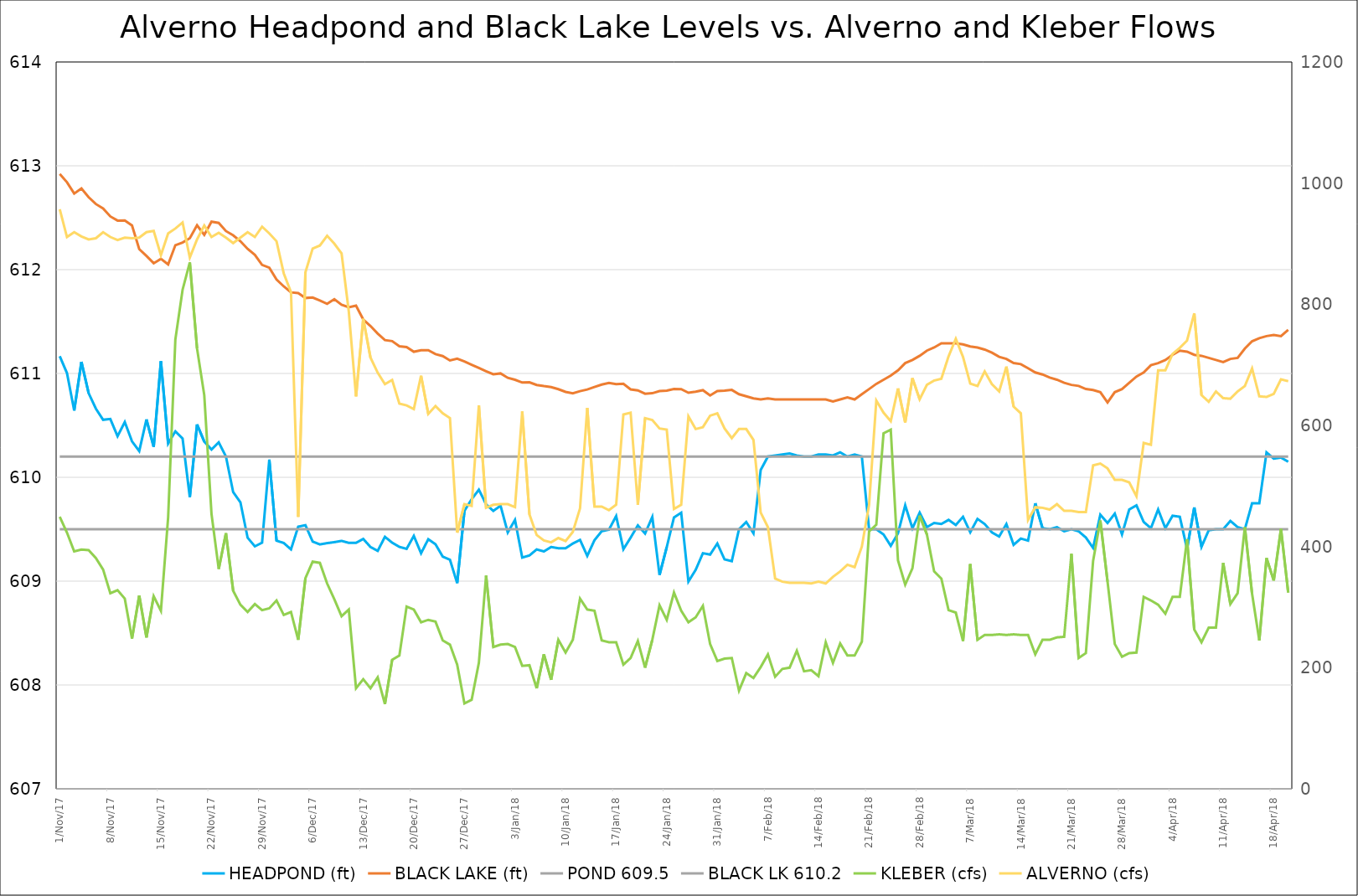
| Category | HEADPOND (ft) | BLACK LAKE (ft) | POND 609.5 | BLACK LK 610.2 |
|---|---|---|---|---|
| 2017-11-01 | 611.166 | 612.922 | 609.5 | 610.2 |
| 2017-11-02 | 611.004 | 612.842 | 609.5 | 610.2 |
| 2017-11-03 | 610.644 | 612.733 | 609.5 | 610.2 |
| 2017-11-04 | 611.111 | 612.782 | 609.5 | 610.2 |
| 2017-11-05 | 610.81 | 612.698 | 609.5 | 610.2 |
| 2017-11-06 | 610.662 | 612.632 | 609.5 | 610.2 |
| 2017-11-07 | 610.554 | 612.589 | 609.5 | 610.2 |
| 2017-11-08 | 610.562 | 612.513 | 609.5 | 610.2 |
| 2017-11-09 | 610.396 | 612.472 | 609.5 | 610.2 |
| 2017-11-10 | 610.532 | 612.473 | 609.5 | 610.2 |
| 2017-11-11 | 610.346 | 612.425 | 609.5 | 610.2 |
| 2017-11-12 | 610.253 | 612.198 | 609.5 | 610.2 |
| 2017-11-13 | 610.557 | 612.132 | 609.5 | 610.2 |
| 2017-11-14 | 610.294 | 612.061 | 609.5 | 610.2 |
| 2017-11-15 | 611.119 | 612.104 | 609.5 | 610.2 |
| 2017-11-16 | 610.325 | 612.051 | 609.5 | 610.2 |
| 2017-11-17 | 610.443 | 612.235 | 609.5 | 610.2 |
| 2017-11-18 | 610.373 | 612.261 | 609.5 | 610.2 |
| 2017-11-19 | 609.809 | 612.303 | 609.5 | 610.2 |
| 2017-11-20 | 610.509 | 612.427 | 609.5 | 610.2 |
| 2017-11-21 | 610.344 | 612.336 | 609.5 | 610.2 |
| 2017-11-22 | 610.268 | 612.462 | 609.5 | 610.2 |
| 2017-11-23 | 610.337 | 612.45 | 609.5 | 610.2 |
| 2017-11-24 | 610.2 | 612.371 | 609.5 | 610.2 |
| 2017-11-25 | 609.857 | 612.331 | 609.5 | 610.2 |
| 2017-11-26 | 609.76 | 612.274 | 609.5 | 610.2 |
| 2017-11-27 | 609.418 | 612.199 | 609.5 | 610.2 |
| 2017-11-28 | 609.335 | 612.143 | 609.5 | 610.2 |
| 2017-11-29 | 609.371 | 612.046 | 609.5 | 610.2 |
| 2017-11-30 | 610.17 | 612.018 | 609.5 | 610.2 |
| 2017-12-01 | 609.39 | 611.905 | 609.5 | 610.2 |
| 2017-12-02 | 609.367 | 611.839 | 609.5 | 610.2 |
| 2017-12-03 | 609.306 | 611.781 | 609.5 | 610.2 |
| 2017-12-04 | 609.525 | 611.774 | 609.5 | 610.2 |
| 2017-12-05 | 609.539 | 611.727 | 609.5 | 610.2 |
| 2017-12-06 | 609.381 | 611.732 | 609.5 | 610.2 |
| 2017-12-07 | 609.354 | 611.703 | 609.5 | 610.2 |
| 2017-12-08 | 609.366 | 611.67 | 609.5 | 610.2 |
| 2017-12-09 | 609.375 | 611.715 | 609.5 | 610.2 |
| 2017-12-10 | 609.388 | 611.662 | 609.5 | 610.2 |
| 2017-12-11 | 609.369 | 611.638 | 609.5 | 610.2 |
| 2017-12-12 | 609.369 | 611.653 | 609.5 | 610.2 |
| 2017-12-13 | 609.407 | 611.52 | 609.5 | 610.2 |
| 2017-12-14 | 609.329 | 611.457 | 609.5 | 610.2 |
| 2017-12-15 | 609.291 | 611.384 | 609.5 | 610.2 |
| 2017-12-16 | 609.427 | 611.321 | 609.5 | 610.2 |
| 2017-12-17 | 609.371 | 611.312 | 609.5 | 610.2 |
| 2017-12-18 | 609.33 | 611.261 | 609.5 | 610.2 |
| 2017-12-19 | 609.311 | 611.254 | 609.5 | 610.2 |
| 2017-12-20 | 609.436 | 611.209 | 609.5 | 610.2 |
| 2017-12-21 | 609.269 | 611.223 | 609.5 | 610.2 |
| 2017-12-22 | 609.404 | 611.224 | 609.5 | 610.2 |
| 2017-12-23 | 609.355 | 611.186 | 609.5 | 610.2 |
| 2017-12-24 | 609.236 | 611.168 | 609.5 | 610.2 |
| 2017-12-25 | 609.206 | 611.125 | 609.5 | 610.2 |
| 2017-12-26 | 608.981 | 611.142 | 609.5 | 610.2 |
| 2017-12-27 | 609.676 | 611.115 | 609.5 | 610.2 |
| 2017-12-28 | 609.789 | 611.084 | 609.5 | 610.2 |
| 2017-12-29 | 609.881 | 611.053 | 609.5 | 610.2 |
| 2017-12-30 | 609.739 | 611.022 | 609.5 | 610.2 |
| 2017-12-31 | 609.676 | 610.992 | 609.5 | 610.2 |
| 2018-01-01 | 609.726 | 611.001 | 609.5 | 610.2 |
| 2018-01-02 | 609.469 | 610.958 | 609.5 | 610.2 |
| 2018-01-03 | 609.59 | 610.939 | 609.5 | 610.2 |
| 2018-01-04 | 609.227 | 610.913 | 609.5 | 610.2 |
| 2018-01-05 | 609.247 | 610.915 | 609.5 | 610.2 |
| 2018-01-06 | 609.305 | 610.889 | 609.5 | 610.2 |
| 2018-01-07 | 609.286 | 610.878 | 609.5 | 610.2 |
| 2018-01-08 | 609.329 | 610.869 | 609.5 | 610.2 |
| 2018-01-09 | 609.317 | 610.848 | 609.5 | 610.2 |
| 2018-01-10 | 609.317 | 610.823 | 609.5 | 610.2 |
| 2018-01-11 | 609.362 | 610.808 | 609.5 | 610.2 |
| 2018-01-12 | 609.397 | 610.83 | 609.5 | 610.2 |
| 2018-01-13 | 609.243 | 610.845 | 609.5 | 610.2 |
| 2018-01-14 | 609.395 | 610.869 | 609.5 | 610.2 |
| 2018-01-15 | 609.481 | 610.893 | 609.5 | 610.2 |
| 2018-01-16 | 609.496 | 610.909 | 609.5 | 610.2 |
| 2018-01-17 | 609.627 | 610.897 | 609.5 | 610.2 |
| 2018-01-18 | 609.307 | 610.901 | 609.5 | 610.2 |
| 2018-01-19 | 609.419 | 610.847 | 609.5 | 610.2 |
| 2018-01-20 | 609.537 | 610.837 | 609.5 | 610.2 |
| 2018-01-21 | 609.459 | 610.805 | 609.5 | 610.2 |
| 2018-01-22 | 609.618 | 610.81 | 609.5 | 610.2 |
| 2018-01-23 | 609.06 | 610.831 | 609.5 | 610.2 |
| 2018-01-24 | 609.327 | 610.834 | 609.5 | 610.2 |
| 2018-01-25 | 609.613 | 610.85 | 609.5 | 610.2 |
| 2018-01-26 | 609.659 | 610.849 | 609.5 | 610.2 |
| 2018-01-27 | 608.996 | 610.814 | 609.5 | 610.2 |
| 2018-01-28 | 609.108 | 610.825 | 609.5 | 610.2 |
| 2018-01-29 | 609.269 | 610.839 | 609.5 | 610.2 |
| 2018-01-30 | 609.255 | 610.788 | 609.5 | 610.2 |
| 2018-01-31 | 609.362 | 610.83 | 609.5 | 610.2 |
| 2018-02-01 | 609.21 | 610.834 | 609.5 | 610.2 |
| 2018-02-02 | 609.193 | 610.842 | 609.5 | 610.2 |
| 2018-02-03 | 609.5 | 610.8 | 609.5 | 610.2 |
| 2018-02-04 | 609.57 | 610.78 | 609.5 | 610.2 |
| 2018-02-05 | 609.46 | 610.76 | 609.5 | 610.2 |
| 2018-02-06 | 610.07 | 610.75 | 609.5 | 610.2 |
| 2018-02-07 | 610.2 | 610.76 | 609.5 | 610.2 |
| 2018-02-08 | 610.21 | 610.75 | 609.5 | 610.2 |
| 2018-02-09 | 610.22 | 610.75 | 609.5 | 610.2 |
| 2018-02-10 | 610.23 | 610.75 | 609.5 | 610.2 |
| 2018-02-11 | 610.21 | 610.75 | 609.5 | 610.2 |
| 2018-02-12 | 610.2 | 610.75 | 609.5 | 610.2 |
| 2018-02-13 | 610.2 | 610.75 | 609.5 | 610.2 |
| 2018-02-14 | 610.22 | 610.75 | 609.5 | 610.2 |
| 2018-02-15 | 610.22 | 610.75 | 609.5 | 610.2 |
| 2018-02-16 | 610.21 | 610.73 | 609.5 | 610.2 |
| 2018-02-17 | 610.24 | 610.75 | 609.5 | 610.2 |
| 2018-02-18 | 610.2 | 610.77 | 609.5 | 610.2 |
| 2018-02-19 | 610.22 | 610.75 | 609.5 | 610.2 |
| 2018-02-20 | 610.2 | 610.8 | 609.5 | 610.2 |
| 2018-02-21 | 609.5 | 610.85 | 609.5 | 610.2 |
| 2018-02-22 | 609.5 | 610.9 | 609.5 | 610.2 |
| 2018-02-23 | 609.45 | 610.94 | 609.5 | 610.2 |
| 2018-02-24 | 609.34 | 610.98 | 609.5 | 610.2 |
| 2018-02-25 | 609.46 | 611.03 | 609.5 | 610.2 |
| 2018-02-26 | 609.73 | 611.1 | 609.5 | 610.2 |
| 2018-02-27 | 609.51 | 611.13 | 609.5 | 610.2 |
| 2018-02-28 | 609.66 | 611.17 | 609.5 | 610.2 |
| 2018-03-01 | 609.52 | 611.22 | 609.5 | 610.2 |
| 2018-03-02 | 609.56 | 611.25 | 609.5 | 610.2 |
| 2018-03-03 | 609.55 | 611.29 | 609.5 | 610.2 |
| 2018-03-04 | 609.59 | 611.29 | 609.5 | 610.2 |
| 2018-03-05 | 609.54 | 611.29 | 609.5 | 610.2 |
| 2018-03-06 | 609.62 | 611.28 | 609.5 | 610.2 |
| 2018-03-07 | 609.47 | 611.26 | 609.5 | 610.2 |
| 2018-03-08 | 609.6 | 611.25 | 609.5 | 610.2 |
| 2018-03-09 | 609.55 | 611.23 | 609.5 | 610.2 |
| 2018-03-10 | 609.47 | 611.2 | 609.5 | 610.2 |
| 2018-03-11 | 609.43 | 611.16 | 609.5 | 610.2 |
| 2018-03-12 | 609.55 | 611.14 | 609.5 | 610.2 |
| 2018-03-13 | 609.35 | 611.1 | 609.5 | 610.2 |
| 2018-03-14 | 609.41 | 611.09 | 609.5 | 610.2 |
| 2018-03-15 | 609.39 | 611.05 | 609.5 | 610.2 |
| 2018-03-16 | 609.75 | 611.01 | 609.5 | 610.2 |
| 2018-03-17 | 609.51 | 610.99 | 609.5 | 610.2 |
| 2018-03-18 | 609.5 | 610.96 | 609.5 | 610.2 |
| 2018-03-19 | 609.52 | 610.94 | 609.5 | 610.2 |
| 2018-03-20 | 609.48 | 610.91 | 609.5 | 610.2 |
| 2018-03-21 | 609.5 | 610.89 | 609.5 | 610.2 |
| 2018-03-22 | 609.48 | 610.88 | 609.5 | 610.2 |
| 2018-03-23 | 609.42 | 610.85 | 609.5 | 610.2 |
| 2018-03-24 | 609.32 | 610.84 | 609.5 | 610.2 |
| 2018-03-25 | 609.64 | 610.82 | 609.5 | 610.2 |
| 2018-03-26 | 609.56 | 610.72 | 609.5 | 610.2 |
| 2018-03-27 | 609.65 | 610.82 | 609.5 | 610.2 |
| 2018-03-28 | 609.45 | 610.85 | 609.5 | 610.2 |
| 2018-03-29 | 609.69 | 610.91 | 609.5 | 610.2 |
| 2018-03-30 | 609.73 | 610.97 | 609.5 | 610.2 |
| 2018-03-31 | 609.57 | 611.01 | 609.5 | 610.2 |
| 2018-04-01 | 609.51 | 611.08 | 609.5 | 610.2 |
| 2018-04-02 | 609.69 | 611.1 | 609.5 | 610.2 |
| 2018-04-03 | 609.51 | 611.13 | 609.5 | 610.2 |
| 2018-04-04 | 609.63 | 611.18 | 609.5 | 610.2 |
| 2018-04-05 | 609.62 | 611.22 | 609.5 | 610.2 |
| 2018-04-06 | 609.31 | 611.21 | 609.5 | 610.2 |
| 2018-04-07 | 609.71 | 611.18 | 609.5 | 610.2 |
| 2018-04-08 | 609.33 | 611.17 | 609.5 | 610.2 |
| 2018-04-09 | 609.49 | 611.15 | 609.5 | 610.2 |
| 2018-04-10 | 609.5 | 611.13 | 609.5 | 610.2 |
| 2018-04-11 | 609.5 | 611.11 | 609.5 | 610.2 |
| 2018-04-12 | 609.58 | 611.14 | 609.5 | 610.2 |
| 2018-04-13 | 609.52 | 611.15 | 609.5 | 610.2 |
| 2018-04-14 | 609.5 | 611.24 | 609.5 | 610.2 |
| 2018-04-15 | 609.75 | 611.31 | 609.5 | 610.2 |
| 2018-04-16 | 609.75 | 611.34 | 609.5 | 610.2 |
| 2018-04-17 | 610.24 | 611.36 | 609.5 | 610.2 |
| 2018-04-18 | 610.18 | 611.37 | 609.5 | 610.2 |
| 2018-04-19 | 610.19 | 611.36 | 609.5 | 610.2 |
| 2018-04-20 | 610.15 | 611.42 | 609.5 | 610.2 |